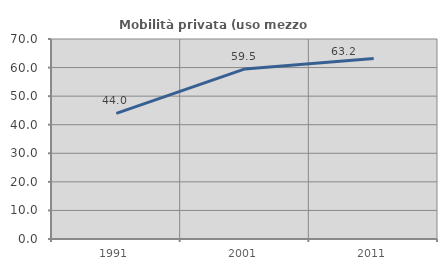
| Category | Mobilità privata (uso mezzo privato) |
|---|---|
| 1991.0 | 43.977 |
| 2001.0 | 59.524 |
| 2011.0 | 63.197 |